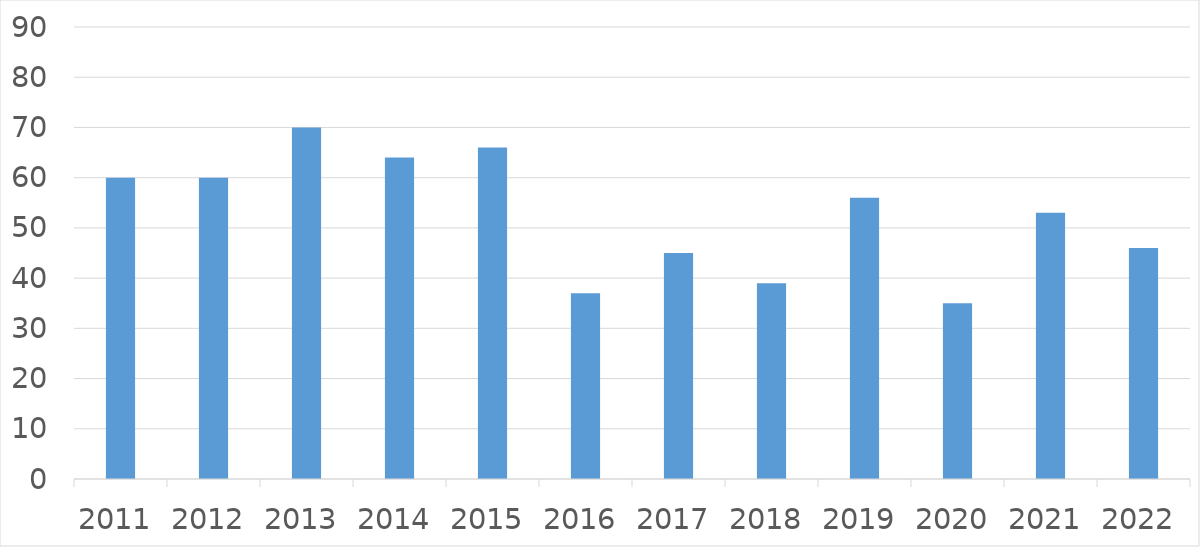
| Category | Series 0 |
|---|---|
| 2011 | 60 |
| 2012 | 60 |
| 2013 | 70 |
| 2014 | 64 |
| 2015 | 66 |
| 2016 | 37 |
| 2017 | 45 |
| 2018 | 39 |
| 2019 | 56 |
| 2020 | 35 |
| 2021 | 53 |
| 2022 | 46 |